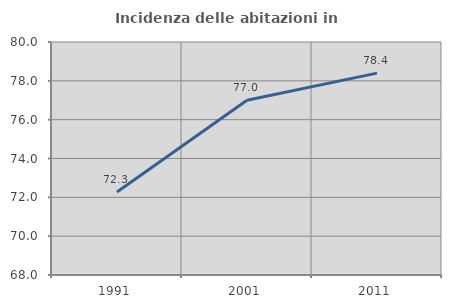
| Category | Incidenza delle abitazioni in proprietà  |
|---|---|
| 1991.0 | 72.271 |
| 2001.0 | 77.003 |
| 2011.0 | 78.398 |